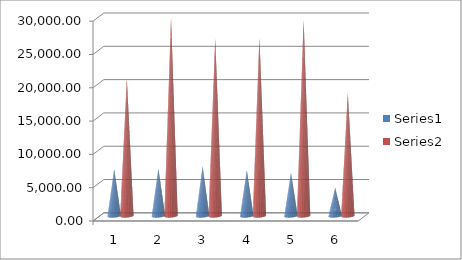
| Category | Series 0 | Series 1 |
|---|---|---|
| 0 | 7001.4 | 20622.99 |
| 1 | 7082.54 | 29680.81 |
| 2 | 7415.25 | 26640.22 |
| 3 | 6884.35 | 26805.45 |
| 4 | 6447.27 | 29429.2 |
| 5 | 4245.54 | 18398.85 |